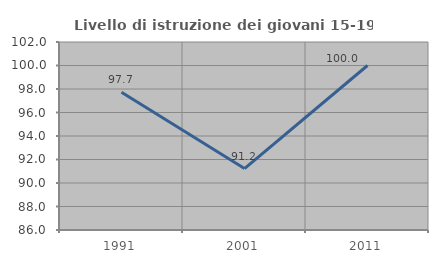
| Category | Livello di istruzione dei giovani 15-19 anni |
|---|---|
| 1991.0 | 97.727 |
| 2001.0 | 91.228 |
| 2011.0 | 100 |